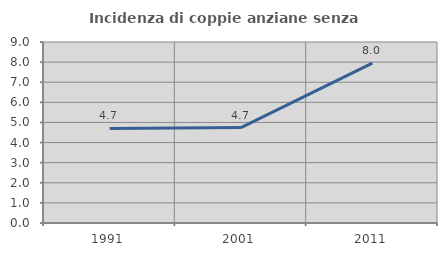
| Category | Incidenza di coppie anziane senza figli  |
|---|---|
| 1991.0 | 4.704 |
| 2001.0 | 4.744 |
| 2011.0 | 7.952 |